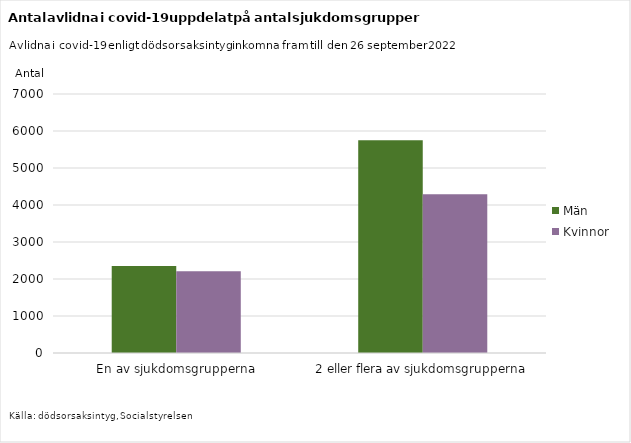
| Category | Män | Kvinnor |
|---|---|---|
| En av sjukdomsgrupperna | 2350 | 2212 |
| 2 eller flera av sjukdomsgrupperna | 5752 | 4288 |